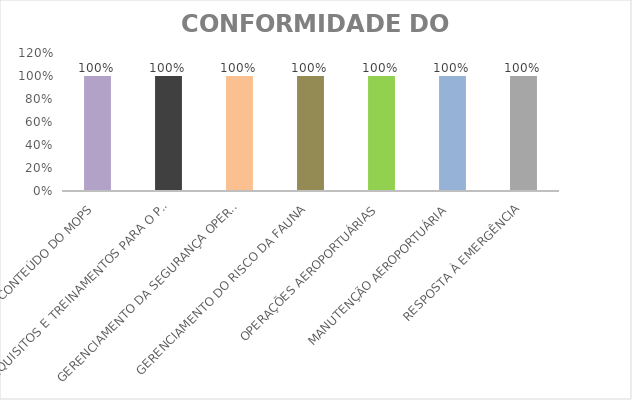
| Category | Series 0 |
|---|---|
| CONTEÚDO DO MOPS | 1 |
| REQUISITOS E TREINAMENTOS PARA O PESSOAL | 1 |
| GERENCIAMENTO DA SEGURANÇA OPERACIONAL | 1 |
| GERENCIAMENTO DO RISCO DA FAUNA | 1 |
| OPERAÇÕES AEROPORTUÁRIAS | 1 |
| MANUTENÇÃO AEROPORTUÁRIA | 1 |
| RESPOSTA À EMERGÊNCIA | 1 |